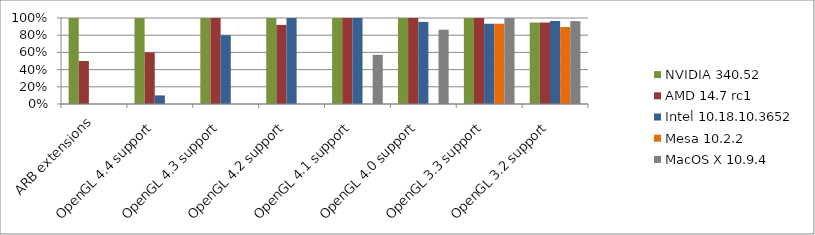
| Category | NVIDIA 340.52 | AMD 14.7 rc1 | Intel 10.18.10.3652 | Mesa 10.2.2 | MacOS X 10.9.4 |
|---|---|---|---|---|---|
| ARB extensions | 1 | 0.5 | 0 | 0 | 0 |
| OpenGL 4.4 support | 1 | 0.6 | 0.1 | 0 | 0 |
| OpenGL 4.3 support | 1 | 1 | 0.8 | 0 | 0 |
| OpenGL 4.2 support | 1 | 0.92 | 1 | 0 | 0 |
| OpenGL 4.1 support | 1 | 1 | 1 | 0 | 0.571 |
| OpenGL 4.0 support | 1 | 1 | 0.955 | 0 | 0.864 |
| OpenGL 3.3 support | 1 | 1 | 0.933 | 0.933 | 1 |
| OpenGL 3.2 support | 0.947 | 0.947 | 0.965 | 0.895 | 0.964 |